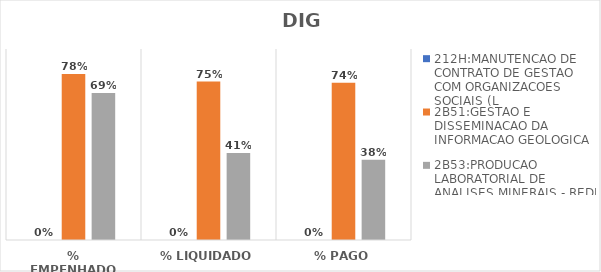
| Category | 212H:MANUTENCAO DE CONTRATO DE GESTAO COM ORGANIZACOES SOCIAIS (L | 2B51:GESTAO E DISSEMINACAO DA INFORMACAO GEOLOGICA | 2B53:PRODUCAO LABORATORIAL DE ANALISES MINERAIS - REDE LAMIN |
|---|---|---|---|
| % EMPENHADO | 0 | 0.782 | 0.693 |
| % LIQUIDADO | 0 | 0.746 | 0.41 |
| % PAGO | 0 | 0.741 | 0.378 |